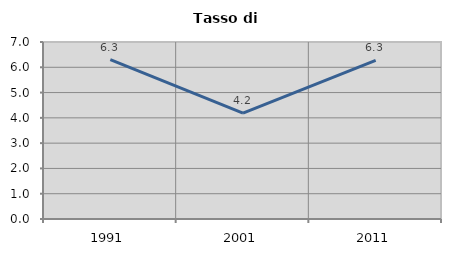
| Category | Tasso di disoccupazione   |
|---|---|
| 1991.0 | 6.305 |
| 2001.0 | 4.19 |
| 2011.0 | 6.274 |